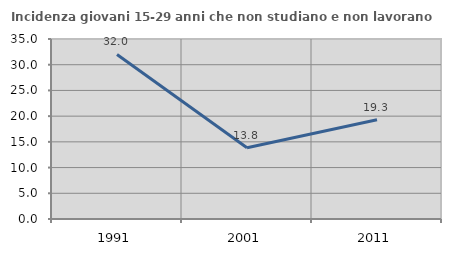
| Category | Incidenza giovani 15-29 anni che non studiano e non lavorano  |
|---|---|
| 1991.0 | 32 |
| 2001.0 | 13.846 |
| 2011.0 | 19.298 |